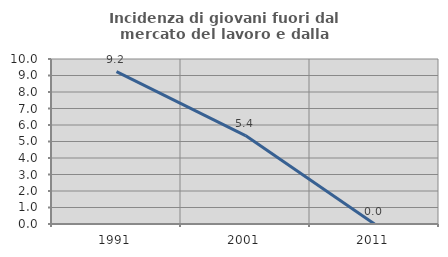
| Category | Incidenza di giovani fuori dal mercato del lavoro e dalla formazione  |
|---|---|
| 1991.0 | 9.231 |
| 2001.0 | 5.357 |
| 2011.0 | 0 |